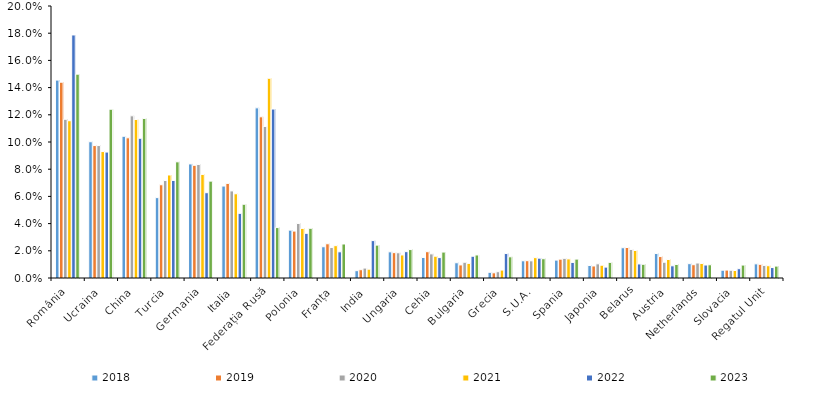
| Category | 2018 | 2019 | 2020 | 2021 | 2022 | 2023 |
|---|---|---|---|---|---|---|
| România | 14.552 | 14.398 | 11.668 | 11.564 | 17.871 | 14.989 |
| Ucraina | 10.019 | 9.738 | 9.738 | 9.297 | 9.261 | 12.408 |
| China | 10.421 | 10.309 | 11.925 | 11.656 | 10.274 | 11.731 |
| Turcia | 5.91 | 6.856 | 7.167 | 7.576 | 7.173 | 8.541 |
| Germania | 8.387 | 8.286 | 8.349 | 7.617 | 6.271 | 7.124 |
| Italia | 6.762 | 6.956 | 6.404 | 6.193 | 4.754 | 5.422 |
| Federația Rusă | 12.511 | 11.853 | 11.143 | 14.685 | 12.423 | 3.708 |
| Polonia | 3.519 | 3.451 | 4.01 | 3.645 | 3.285 | 3.655 |
| Franța | 2.298 | 2.516 | 2.24 | 2.378 | 1.927 | 2.501 |
| India | 0.539 | 0.61 | 0.73 | 0.648 | 2.75 | 2.418 |
| Ungaria | 1.922 | 1.864 | 1.855 | 1.694 | 1.938 | 2.091 |
| Cehia | 1.51 | 1.933 | 1.774 | 1.602 | 1.5 | 1.908 |
| Bulgaria | 1.121 | 0.962 | 1.158 | 1.076 | 1.6 | 1.694 |
| Grecia | 0.419 | 0.38 | 0.463 | 0.584 | 1.799 | 1.557 |
| S.U.A. | 1.265 | 1.272 | 1.264 | 1.496 | 1.459 | 1.417 |
| Spania | 1.317 | 1.386 | 1.445 | 1.403 | 1.145 | 1.391 |
| Japonia | 0.921 | 0.884 | 1.042 | 0.94 | 0.802 | 1.148 |
| Belarus | 2.225 | 2.242 | 2.101 | 2.024 | 1.033 | 1.01 |
| Austria | 1.799 | 1.577 | 1.158 | 1.362 | 0.897 | 0.997 |
| Netherlands | 1.053 | 0.978 | 1.102 | 1.07 | 0.954 | 0.973 |
| Slovacia | 0.574 | 0.585 | 0.569 | 0.552 | 0.685 | 0.951 |
| Regatul Unit  | 1.041 | 1.005 | 0.926 | 0.903 | 0.769 | 0.876 |